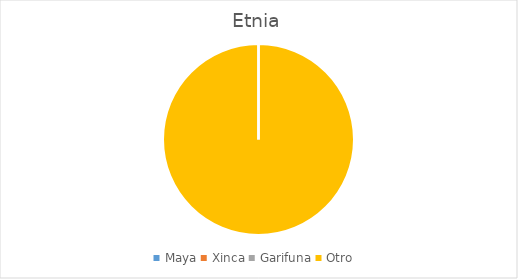
| Category | Series 0 |
|---|---|
| Maya | 0 |
| Xinca | 0 |
| Garifuna | 0 |
| Otro | 105 |